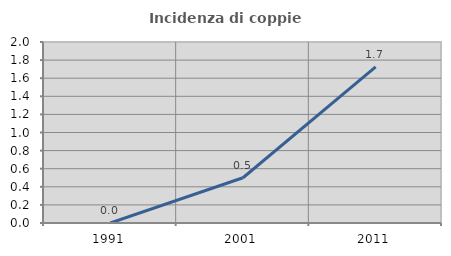
| Category | Incidenza di coppie miste |
|---|---|
| 1991.0 | 0 |
| 2001.0 | 0.5 |
| 2011.0 | 1.724 |